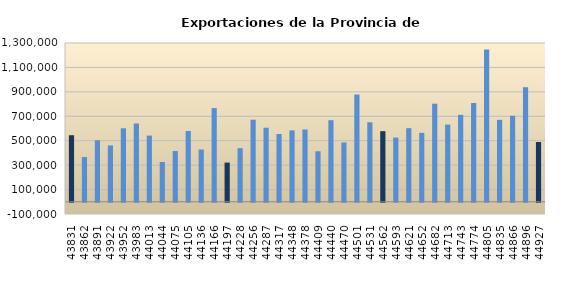
| Category | Exportaciones |
|---|---|
| 2020-01-01 | 544870.53 |
| 2020-02-01 | 366257.69 |
| 2020-03-01 | 503457.96 |
| 2020-04-01 | 461491.76 |
| 2020-05-01 | 601776.55 |
| 2020-06-01 | 641019.7 |
| 2020-07-01 | 542062.84 |
| 2020-08-01 | 326019.87 |
| 2020-09-01 | 415851.9 |
| 2020-10-01 | 579330.62 |
| 2020-11-01 | 428116.983 |
| 2020-12-01 | 766984.753 |
| 2021-01-01 | 321034.51 |
| 2021-02-01 | 439118.25 |
| 2021-03-01 | 672033.91 |
| 2021-04-01 | 606425.01 |
| 2021-05-01 | 555191.59 |
| 2021-06-01 | 584517.86 |
| 2021-07-01 | 592215.46 |
| 2021-08-01 | 413833.07 |
| 2021-09-01 | 667860.28 |
| 2021-10-01 | 485511.53 |
| 2021-11-01 | 878182.96 |
| 2021-12-01 | 651099.404 |
| 2022-01-01 | 578231.872 |
| 2022-02-01 | 525546.083 |
| 2022-03-01 | 602474.187 |
| 2022-04-01 | 564566.111 |
| 2022-05-01 | 803329.469 |
| 2022-06-01 | 632182.316 |
| 2022-07-01 | 711919.091 |
| 2022-08-01 | 808936.658 |
| 2022-09-01 | 1246269.653 |
| 2022-10-01 | 670788.005 |
| 2022-11-01 | 704215.36 |
| 2022-12-01 | 938097.978 |
| 2023-01-01 | 489684.135 |